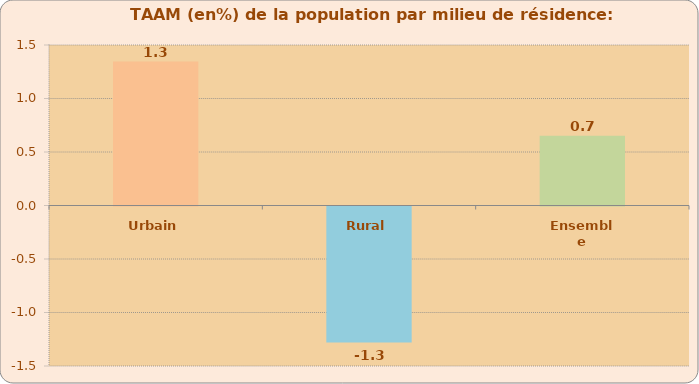
| Category | 2014-2030 |
|---|---|
| Urbain | 1.345 |
| Rural | -1.27 |
| Ensemble | 0.652 |